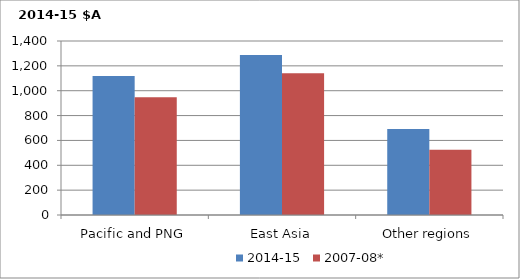
| Category | 2014-15 | 2007-08* |
|---|---|---|
| Pacific and PNG | 1118.957 | 947.91 |
| East Asia | 1288.155 | 1141.494 |
| Other regions | 691.449 | 524.021 |